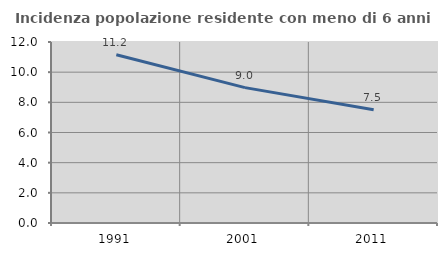
| Category | Incidenza popolazione residente con meno di 6 anni |
|---|---|
| 1991.0 | 11.154 |
| 2001.0 | 8.974 |
| 2011.0 | 7.509 |